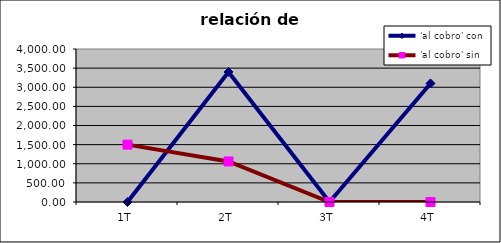
| Category | 'al cobro' con | 'al cobro' sin |
|---|---|---|
| 1T | 0 | 1500 |
| 2T | 3400 | 1060 |
| 3T | 0 | 0 |
| 4T | 3100 | 0 |